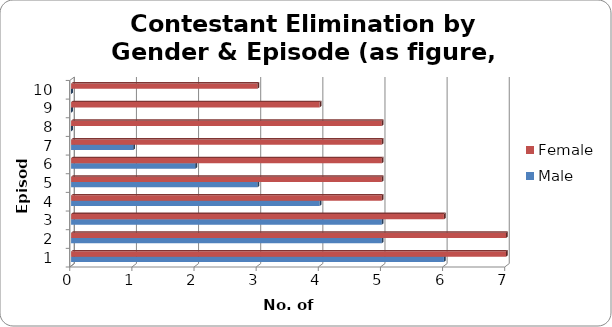
| Category | Male | Female |
|---|---|---|
| 0 | 6 | 7 |
| 1 | 5 | 7 |
| 2 | 5 | 6 |
| 3 | 4 | 5 |
| 4 | 3 | 5 |
| 5 | 2 | 5 |
| 6 | 1 | 5 |
| 7 | 0 | 5 |
| 8 | 0 | 4 |
| 9 | 0 | 3 |